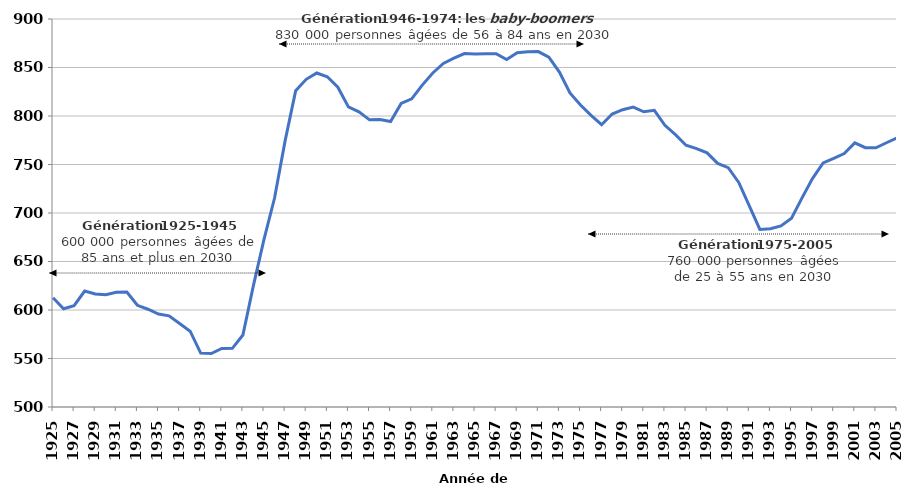
| Category | Series 0 |
|---|---|
| 1925.0 | 612654.86 |
| 1926.0 | 601305.55 |
| 1927.0 | 604408.894 |
| 1928.0 | 619545.234 |
| 1929.0 | 616493.07 |
| 1930.0 | 615841.592 |
| 1931.0 | 618322.244 |
| 1932.0 | 618509.664 |
| 1933.0 | 604849.07 |
| 1934.0 | 600791.064 |
| 1935.0 | 595838.504 |
| 1936.0 | 593992.986 |
| 1937.0 | 586178.536 |
| 1938.0 | 578136.974 |
| 1939.0 | 555609.198 |
| 1940.0 | 555132.918 |
| 1941.0 | 560317.83 |
| 1942.0 | 560454.762 |
| 1943.0 | 574203.156 |
| 1944.0 | 625448.65 |
| 1945.0 | 672762.43 |
| 1946.0 | 715451.744 |
| 1947.0 | 774333.726 |
| 1948.0 | 825947.2 |
| 1949.0 | 837829.79 |
| 1950.0 | 844341.98 |
| 1951.0 | 840418.802 |
| 1952.0 | 829633.928 |
| 1953.0 | 809430.878 |
| 1954.0 | 804229.144 |
| 1955.0 | 796041.686 |
| 1956.0 | 796422.236 |
| 1957.0 | 794373.882 |
| 1958.0 | 812947.852 |
| 1959.0 | 817686.57 |
| 1960.0 | 831844.432 |
| 1961.0 | 844326.308 |
| 1962.0 | 854220.798 |
| 1963.0 | 859743.344 |
| 1964.0 | 864318.314 |
| 1965.0 | 863979.094 |
| 1966.0 | 864186.974 |
| 1967.0 | 864298.312 |
| 1968.0 | 858293.976 |
| 1969.0 | 865224.958 |
| 1970.0 | 866357.608 |
| 1971.0 | 866381.48 |
| 1972.0 | 860655.584 |
| 1973.0 | 845273.314 |
| 1974.0 | 823694.6 |
| 1975.0 | 811262.384 |
| 1976.0 | 800624.93 |
| 1977.0 | 790993.014 |
| 1978.0 | 802020.08 |
| 1979.0 | 806487.842 |
| 1980.0 | 809242.126 |
| 1981.0 | 804334.39 |
| 1982.0 | 805824.196 |
| 1983.0 | 790375.766 |
| 1984.0 | 780841.648 |
| 1985.0 | 769897.226 |
| 1986.0 | 766342.924 |
| 1987.0 | 761982.614 |
| 1988.0 | 751168.706 |
| 1989.0 | 746696.33 |
| 1990.0 | 731510.072 |
| 1991.0 | 707365.064 |
| 1992.0 | 683082.452 |
| 1993.0 | 683798.63 |
| 1994.0 | 686681.156 |
| 1995.0 | 694667.454 |
| 1996.0 | 715616.84 |
| 1997.0 | 735705.674 |
| 1998.0 | 751703.944 |
| 1999.0 | 756282.158 |
| 2000.0 | 761234.693 |
| 2001.0 | 772338.197 |
| 2002.0 | 767327.4 |
| 2003.0 | 767242 |
| 2004.0 | 772432.2 |
| 2005.0 | 777303.2 |